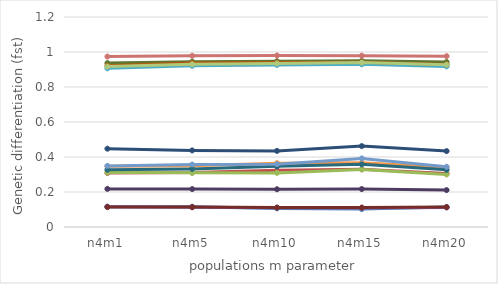
| Category | Series 0 | Series 1 | Series 2 | Series 3 | Series 4 | Series 5 | Series 6 | Series 7 | Series 8 | Series 9 | Series 10 | Series 11 | Series 12 | Series 13 | Series 14 |
|---|---|---|---|---|---|---|---|---|---|---|---|---|---|---|---|
| n4m1 | 0.116 | 0.309 | 0.311 | 0.116 | 0.907 | 0.347 | 0.448 | 0.114 | 0.937 | 0.218 | 0.327 | 0.921 | 0.349 | 0.974 | 0.917 |
| n4m5 | 0.116 | 0.311 | 0.309 | 0.113 | 0.921 | 0.349 | 0.438 | 0.114 | 0.945 | 0.217 | 0.332 | 0.937 | 0.357 | 0.978 | 0.93 |
| n4m10 | 0.106 | 0.324 | 0.309 | 0.111 | 0.926 | 0.364 | 0.435 | 0.111 | 0.947 | 0.216 | 0.346 | 0.939 | 0.359 | 0.98 | 0.935 |
| n4m15 | 0.102 | 0.33 | 0.329 | 0.108 | 0.929 | 0.368 | 0.462 | 0.111 | 0.949 | 0.217 | 0.358 | 0.941 | 0.392 | 0.979 | 0.939 |
| n4m20 | 0.114 | 0.306 | 0.3 | 0.111 | 0.918 | 0.341 | 0.434 | 0.114 | 0.943 | 0.211 | 0.327 | 0.929 | 0.344 | 0.976 | 0.928 |